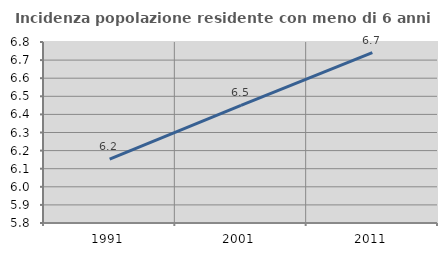
| Category | Incidenza popolazione residente con meno di 6 anni |
|---|---|
| 1991.0 | 6.153 |
| 2001.0 | 6.45 |
| 2011.0 | 6.742 |